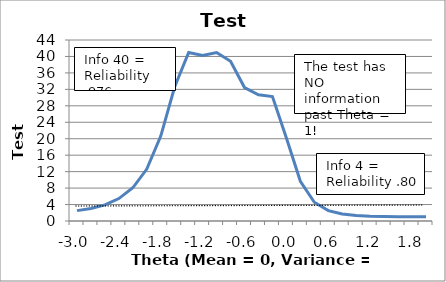
| Category | Test Information |
|---|---|
| -3.0 | 2.518 |
| -2.8 | 3.026 |
| -2.6 | 3.912 |
| -2.4 | 5.45 |
| -2.2 | 8.074 |
| -2.0 | 12.615 |
| -1.8 | 20.648 |
| -1.6 | 32.642 |
| -1.4 | 40.981 |
| -1.2 | 40.256 |
| -1.0 | 40.957 |
| -0.8 | 38.846 |
| -0.6 | 32.448 |
| -0.4 | 30.663 |
| -0.2 | 30.25 |
| 0.0 | 20.156 |
| 0.2 | 9.647 |
| 0.4 | 4.558 |
| 0.6 | 2.515 |
| 0.8 | 1.683 |
| 1.0 | 1.324 |
| 1.2 | 1.161 |
| 1.4 | 1.083 |
| 1.6 | 1.044 |
| 1.8 | 1.024 |
| 2.0 | 1.014 |